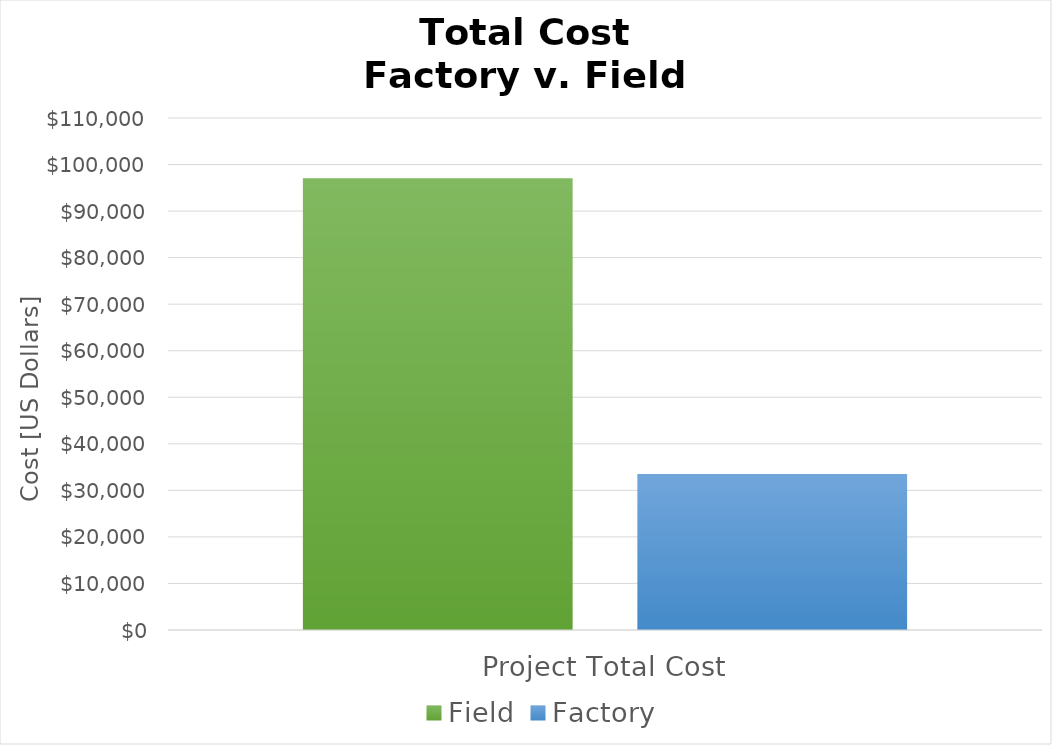
| Category | Field | Factory |
|---|---|---|
| Project Total Cost | 97034.914 | 33514.167 |